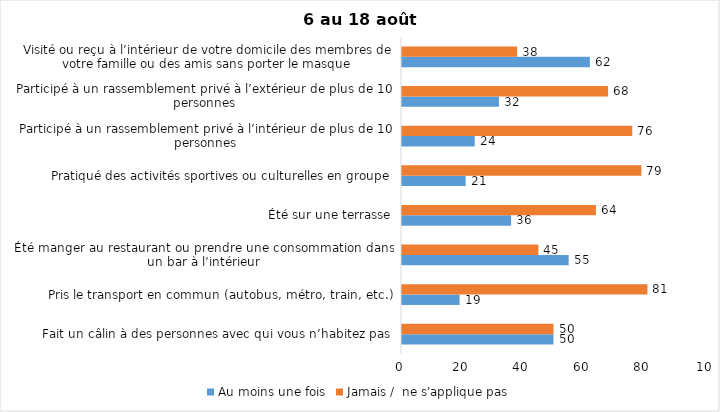
| Category | Au moins une fois | Jamais /  ne s'applique pas |
|---|---|---|
| Fait un câlin à des personnes avec qui vous n’habitez pas | 50 | 50 |
| Pris le transport en commun (autobus, métro, train, etc.) | 19 | 81 |
| Été manger au restaurant ou prendre une consommation dans un bar à l’intérieur | 55 | 45 |
| Été sur une terrasse | 36 | 64 |
| Pratiqué des activités sportives ou culturelles en groupe | 21 | 79 |
| Participé à un rassemblement privé à l’intérieur de plus de 10 personnes | 24 | 76 |
| Participé à un rassemblement privé à l’extérieur de plus de 10 personnes | 32 | 68 |
| Visité ou reçu à l’intérieur de votre domicile des membres de votre famille ou des amis sans porter le masque | 62 | 38 |